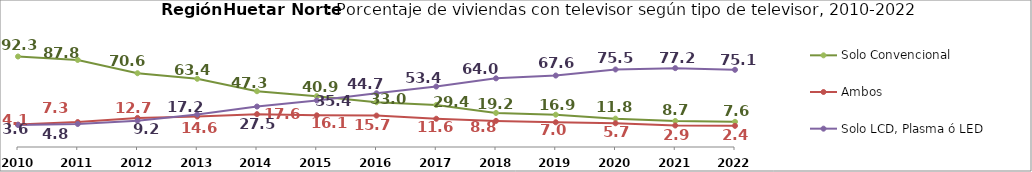
| Category | Solo Convencional | Ambos | Solo LCD, Plasma ó LED |
|---|---|---|---|
| 2010.0 | 92.304 | 4.054 | 3.642 |
| 2011.0 | 87.849 | 7.32 | 4.831 |
| 2012.0 | 70.615 | 12.711 | 9.178 |
| 2013.0 | 63.439 | 14.557 | 17.194 |
| 2014.0 | 47.307 | 17.589 | 27.459 |
| 2015.0 | 40.89 | 16.074 | 35.386 |
| 2016.0 | 33.033 | 15.734 | 44.657 |
| 2017.0 | 29.427 | 11.617 | 53.384 |
| 2018.0 | 19.163 | 8.841 | 63.996 |
| 2019.0 | 16.884 | 7.042 | 67.636 |
| 2020.0 | 11.767 | 5.736 | 75.5 |
| 2021.0 | 8.719 | 2.869 | 77.23 |
| 2022.0 | 7.627 | 2.436 | 75.084 |